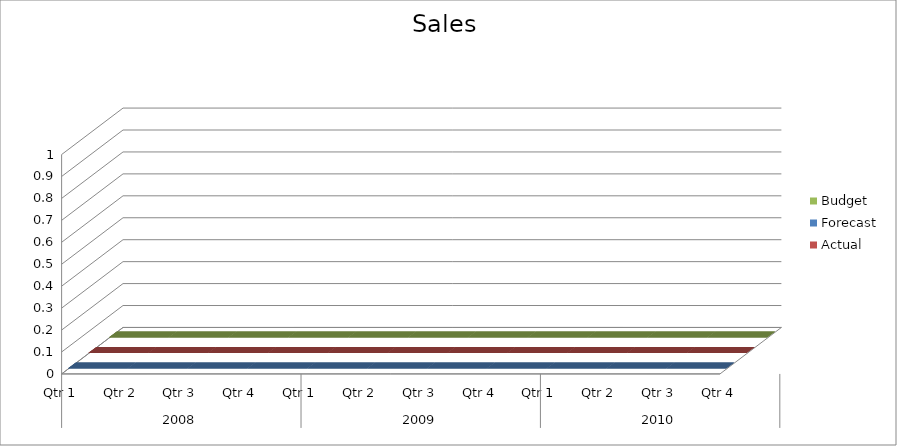
| Category | Budget | Forecast | Actual |
|---|---|---|---|
| 0 | 3130 | 1350 | 770 |
| 1 | 1200 | 1450 | 2630 |
| 2 | 2530 | 1410 | 2800 |
| 3 | 1450 | 890 | 580 |
| 4 | 520 | 960 | 1460 |
| 5 | 780 | 1960 | 2660 |
| 6 | 2750 | 1070 | 1030 |
| 7 | 1570 | 1320 | 1460 |
| 8 | 1930 | 3400 | 2770 |
| 9 | 1180 | 3490 | 1900 |
| 10 | 1530 | 3290 | 2460 |
| 11 | 610 | 2120 | 3000 |